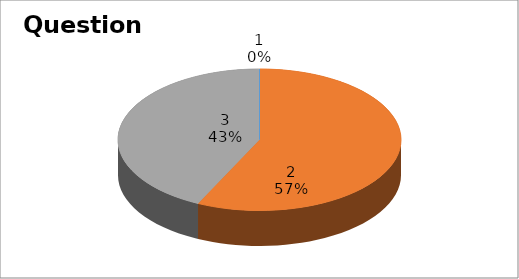
| Category | Series 0 |
|---|---|
| 0 | 0 |
| 1 | 8 |
| 2 | 6 |